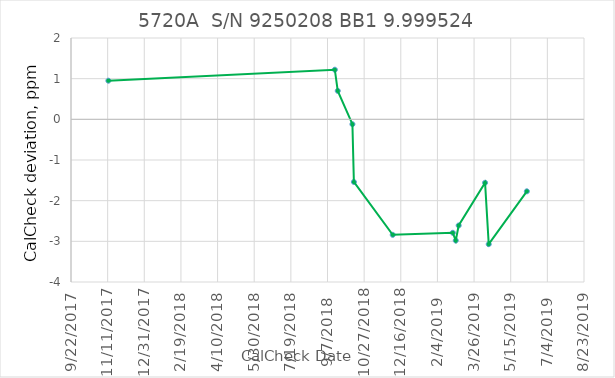
| Category | 9.999524 |
|---|---|
| 43051.0 | 0.95 |
| 43360.0 | 1.22 |
| 43364.0 | 0.7 |
| 43384.0 | -0.12 |
| 43386.0 | -1.54 |
| 43439.0 | -2.84 |
| 43521.0 | -2.79 |
| 43525.0 | -2.98 |
| 43529.0 | -2.61 |
| 43565.0 | -1.56 |
| 43570.0 | -3.07 |
| 43622.0 | -1.77 |